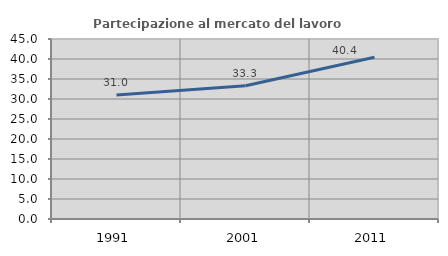
| Category | Partecipazione al mercato del lavoro  femminile |
|---|---|
| 1991.0 | 31.017 |
| 2001.0 | 33.297 |
| 2011.0 | 40.427 |